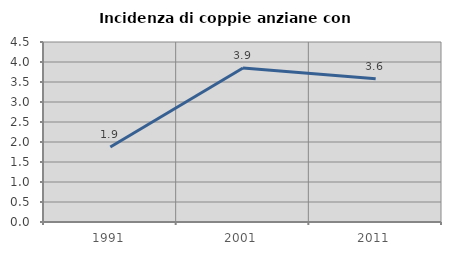
| Category | Incidenza di coppie anziane con figli |
|---|---|
| 1991.0 | 1.876 |
| 2001.0 | 3.851 |
| 2011.0 | 3.583 |